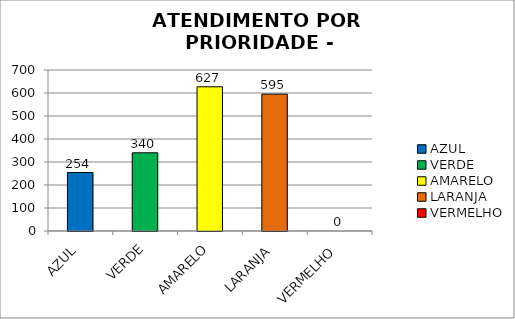
| Category | Total Regional: |
|---|---|
| AZUL | 254 |
| VERDE | 340 |
| AMARELO | 627 |
| LARANJA | 595 |
| VERMELHO | 0 |